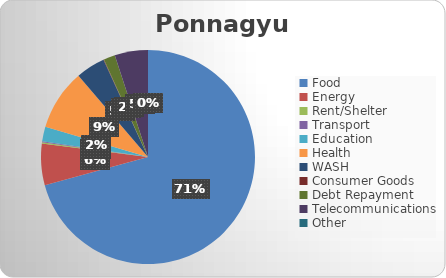
| Category | Series 0 |
|---|---|
| Food  | 137903.226 |
| Energy | 12201.613 |
| Rent/Shelter | 322.581 |
| Transport | 322.581 |
| Education | 4290.323 |
| Health | 17911.29 |
| WASH | 8629.032 |
| Consumer Goods | 145.161 |
| Debt Repayment | 3374.194 |
| Telecommunications | 9790.323 |
| Other  | 0.145 |